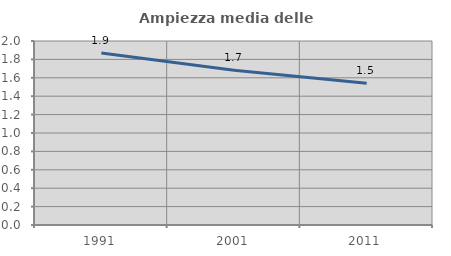
| Category | Ampiezza media delle famiglie |
|---|---|
| 1991.0 | 1.868 |
| 2001.0 | 1.681 |
| 2011.0 | 1.542 |